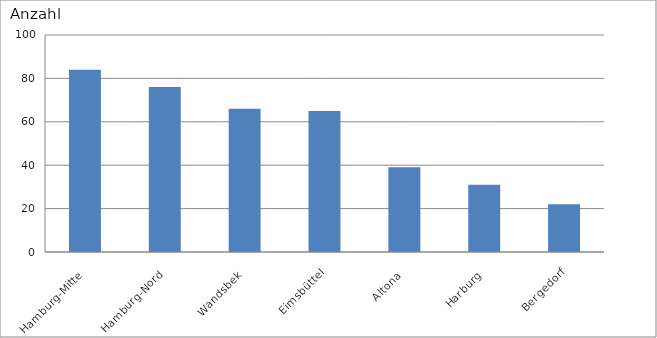
| Category | Hamburg-Mitte |
|---|---|
| Hamburg-Mitte | 84 |
| Hamburg-Nord | 76 |
| Wandsbek | 66 |
| Eimsbüttel | 65 |
| Altona | 39 |
| Harburg | 31 |
| Bergedorf | 22 |